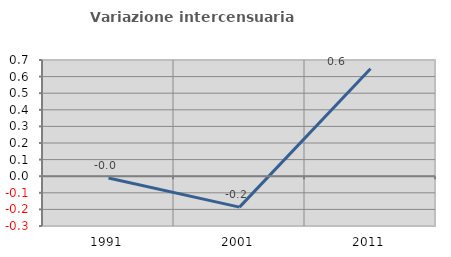
| Category | Variazione intercensuaria annua |
|---|---|
| 1991.0 | -0.01 |
| 2001.0 | -0.186 |
| 2011.0 | 0.647 |